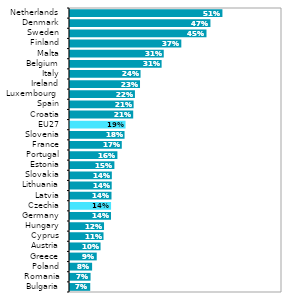
| Category | Series 0 |
|---|---|
| Bulgaria | 0.07 |
| Romania | 0.071 |
| Poland | 0.076 |
| Greece | 0.092 |
| Austria | 0.104 |
| Cyprus | 0.114 |
| Hungary | 0.116 |
| Germany | 0.139 |
| Czechia | 0.139 |
| Latvia | 0.14 |
| Lithuania | 0.141 |
| Slovakia | 0.141 |
| Estonia | 0.15 |
| Portugal | 0.16 |
| France | 0.174 |
| Slovenia | 0.183 |
| EU27 | 0.187 |
| Croatia | 0.212 |
| Spain | 0.213 |
| Luxembourg  | 0.218 |
| Ireland | 0.234 |
| Italy | 0.236 |
| Belgium | 0.306 |
| Malta | 0.313 |
| Finland | 0.371 |
| Sweden | 0.454 |
| Denmark | 0.467 |
| Netherlands | 0.507 |